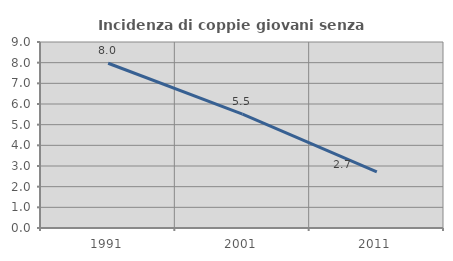
| Category | Incidenza di coppie giovani senza figli |
|---|---|
| 1991.0 | 7.972 |
| 2001.0 | 5.506 |
| 2011.0 | 2.719 |